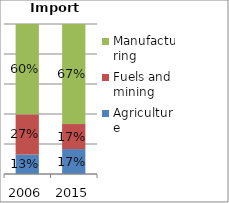
| Category | Agriculture | Fuels and mining | Manufacturing |
|---|---|---|---|
| 2006.0 | 0.13 | 0.268 | 0.602 |
| 2015.0 | 0.166 | 0.167 | 0.667 |